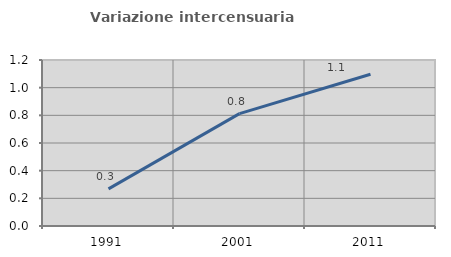
| Category | Variazione intercensuaria annua |
|---|---|
| 1991.0 | 0.268 |
| 2001.0 | 0.812 |
| 2011.0 | 1.097 |